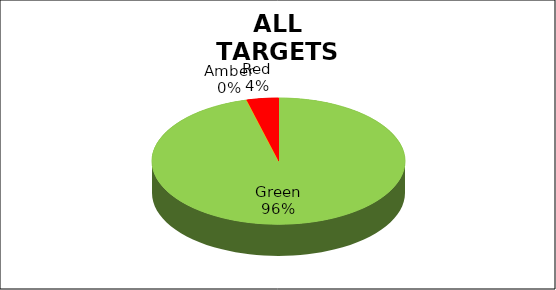
| Category | Series 0 |
|---|---|
| Green | 0.959 |
| Amber | 0 |
| Red | 0.041 |